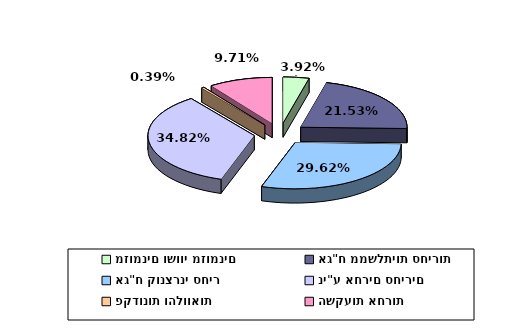
| Category | Series 0 |
|---|---|
| מזומנים ושווי מזומנים | 0.039 |
| אג"ח ממשלתיות סחירות | 0.215 |
| אג"ח קונצרני סחיר | 0.296 |
| ני"ע אחרים סחירים | 0.348 |
| פקדונות והלוואות | 0.004 |
| השקעות אחרות | 0.097 |